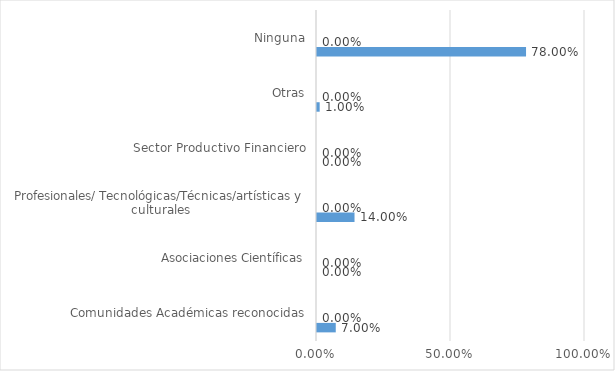
| Category | Series 0 | Series 1 | Series 2 | Series 3 |
|---|---|---|---|---|
| Comunidades Académicas reconocidas | 0.07 | 0 | 0 | 0 |
| Asociaciones Científicas | 0 | 0 | 0 | 0 |
| Profesionales/ Tecnológicas/Técnicas/artísticas y culturales | 0.14 | 0 | 0 | 0 |
| Sector Productivo Financiero | 0 | 0 | 0 | 0 |
| Otras | 0.01 | 0 | 0 | 0 |
| Ninguna | 0.78 | 0 | 0 | 0 |